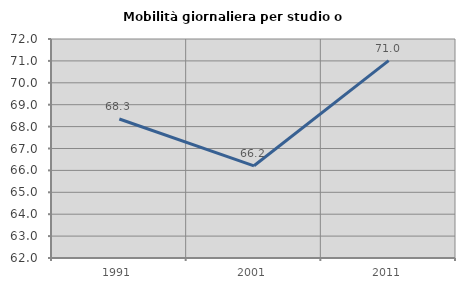
| Category | Mobilità giornaliera per studio o lavoro |
|---|---|
| 1991.0 | 68.347 |
| 2001.0 | 66.21 |
| 2011.0 | 71.015 |